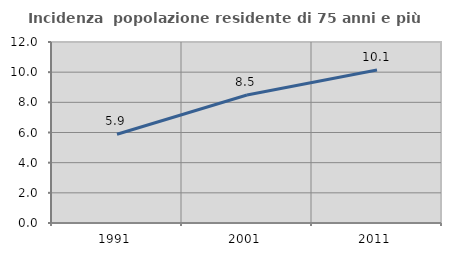
| Category | Incidenza  popolazione residente di 75 anni e più |
|---|---|
| 1991.0 | 5.882 |
| 2001.0 | 8.482 |
| 2011.0 | 10.145 |